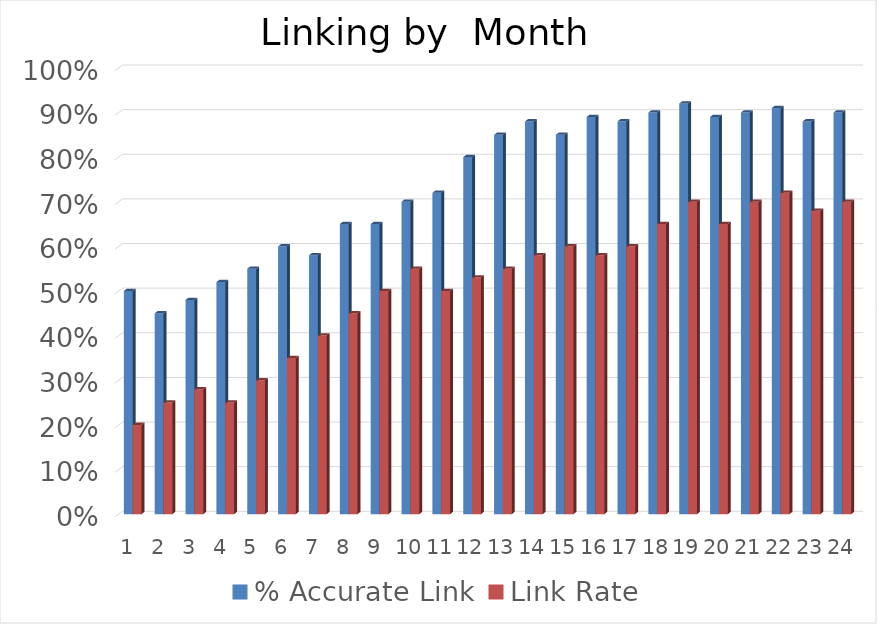
| Category | % Accurate Link | Link Rate |
|---|---|---|
| 0 | 0.5 | 0.2 |
| 1 | 0.45 | 0.25 |
| 2 | 0.48 | 0.28 |
| 3 | 0.52 | 0.25 |
| 4 | 0.55 | 0.3 |
| 5 | 0.6 | 0.35 |
| 6 | 0.58 | 0.4 |
| 7 | 0.65 | 0.45 |
| 8 | 0.65 | 0.5 |
| 9 | 0.7 | 0.55 |
| 10 | 0.72 | 0.5 |
| 11 | 0.8 | 0.53 |
| 12 | 0.85 | 0.55 |
| 13 | 0.88 | 0.58 |
| 14 | 0.85 | 0.6 |
| 15 | 0.89 | 0.58 |
| 16 | 0.88 | 0.6 |
| 17 | 0.9 | 0.65 |
| 18 | 0.92 | 0.7 |
| 19 | 0.89 | 0.65 |
| 20 | 0.9 | 0.7 |
| 21 | 0.91 | 0.72 |
| 22 | 0.88 | 0.68 |
| 23 | 0.9 | 0.7 |